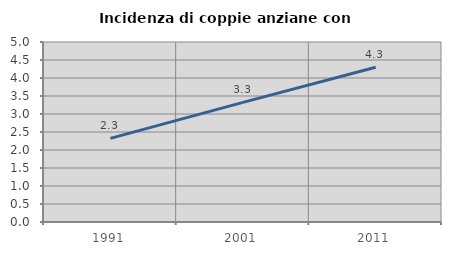
| Category | Incidenza di coppie anziane con figli |
|---|---|
| 1991.0 | 2.324 |
| 2001.0 | 3.322 |
| 2011.0 | 4.297 |